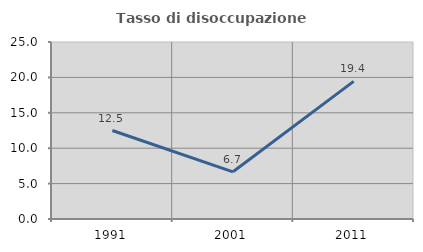
| Category | Tasso di disoccupazione giovanile  |
|---|---|
| 1991.0 | 12.5 |
| 2001.0 | 6.667 |
| 2011.0 | 19.444 |